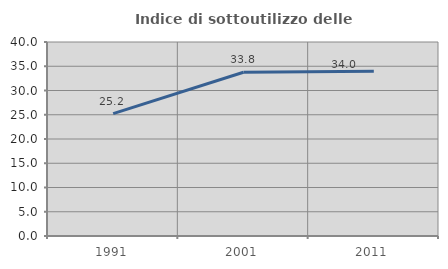
| Category | Indice di sottoutilizzo delle abitazioni  |
|---|---|
| 1991.0 | 25.229 |
| 2001.0 | 33.753 |
| 2011.0 | 33.993 |